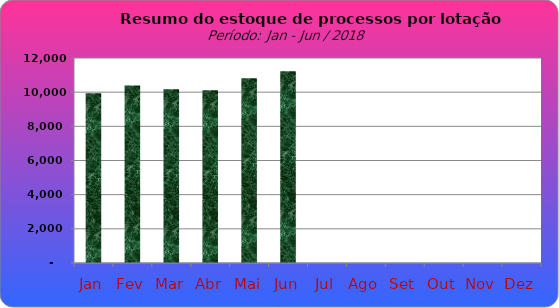
| Category | Series 0 |
|---|---|
| Jan | 9933 |
| Fev | 10393 |
| Mar | 10166 |
| Abr | 10112 |
| Mai | 10819 |
| Jun | 11230 |
| Jul | 0 |
| Ago | 0 |
| Set | 0 |
| Out | 0 |
| Nov | 0 |
| Dez | 0 |